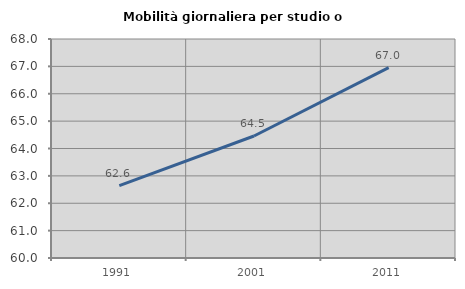
| Category | Mobilità giornaliera per studio o lavoro |
|---|---|
| 1991.0 | 62.64 |
| 2001.0 | 64.456 |
| 2011.0 | 66.956 |